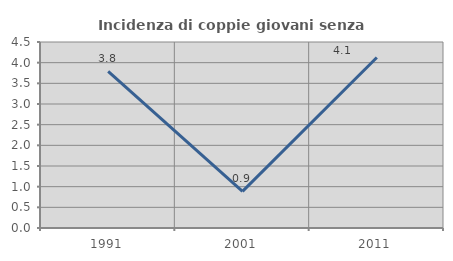
| Category | Incidenza di coppie giovani senza figli |
|---|---|
| 1991.0 | 3.788 |
| 2001.0 | 0.885 |
| 2011.0 | 4.124 |